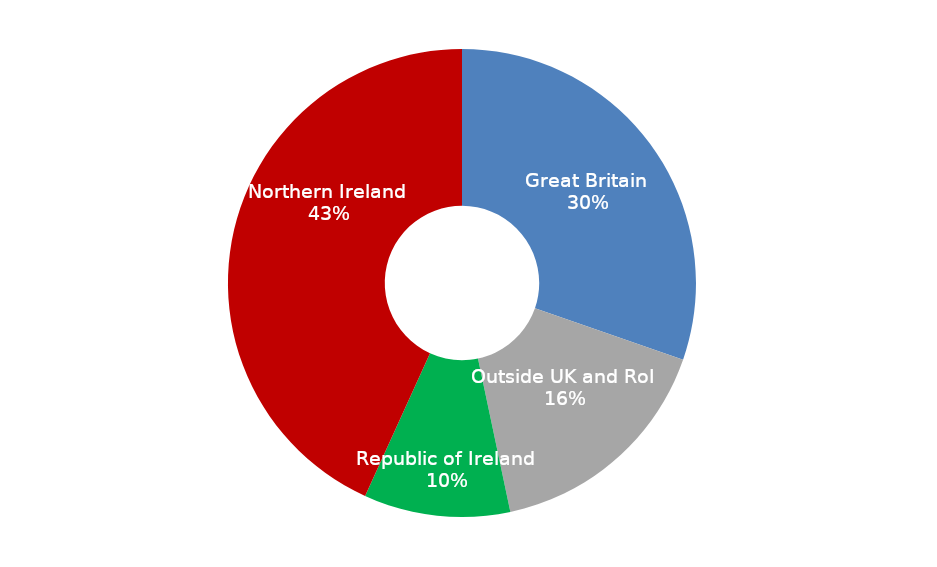
| Category | Overnight Trips  |
|---|---|
| Great Britain  | 1404446.125 |
| Outside UK and RoI  | 758463.792 |
| Republic of Ireland  | 468296 |
| Northern Ireland  | 2001646.514 |